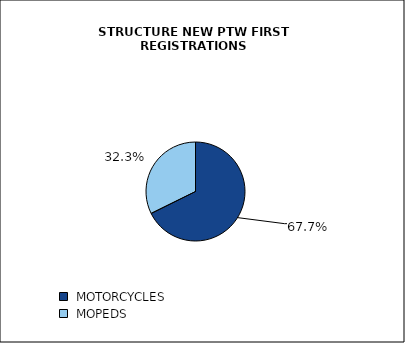
| Category | TOTAL |
|---|---|
|  MOTORCYCLES  | 0.677 |
|  MOPEDS  | 0.323 |